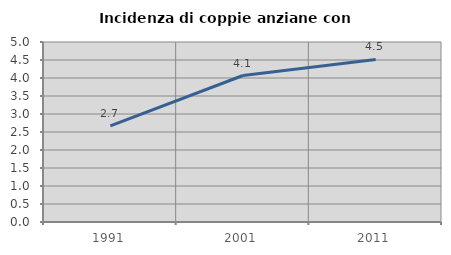
| Category | Incidenza di coppie anziane con figli |
|---|---|
| 1991.0 | 2.669 |
| 2001.0 | 4.069 |
| 2011.0 | 4.516 |